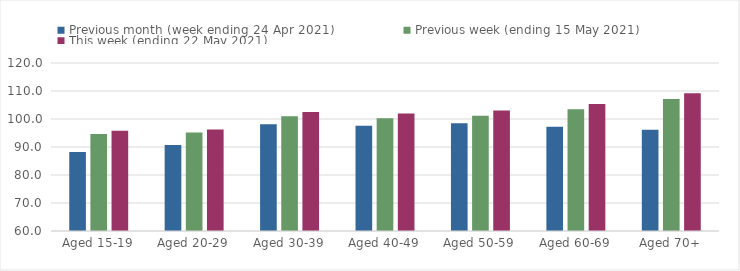
| Category | Previous month (week ending 24 Apr 2021) | Previous week (ending 15 May 2021) | This week (ending 22 May 2021) |
|---|---|---|---|
| Aged 15-19 | 88.24 | 94.6 | 95.76 |
| Aged 20-29 | 90.7 | 95.15 | 96.24 |
| Aged 30-39 | 98.09 | 100.94 | 102.5 |
| Aged 40-49 | 97.55 | 100.23 | 101.98 |
| Aged 50-59 | 98.52 | 101.16 | 103.02 |
| Aged 60-69 | 97.2 | 103.44 | 105.36 |
| Aged 70+ | 96.14 | 107.14 | 109.24 |